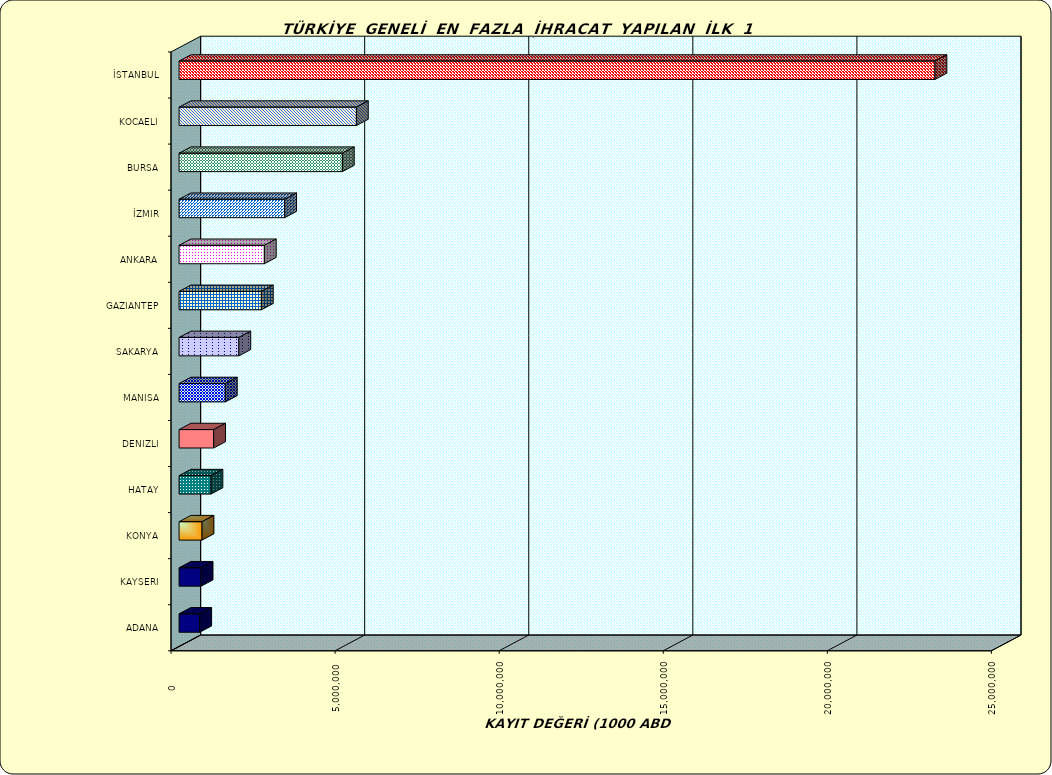
| Category | Series 0 |
|---|---|
| İSTANBUL | 23035047.995 |
| KOCAELI | 5404210.475 |
| BURSA | 4976416.178 |
| İZMIR | 3218469.801 |
| ANKARA | 2598906.577 |
| GAZIANTEP | 2507448.562 |
| SAKARYA | 1822545.963 |
| MANISA | 1410085.672 |
| DENIZLI | 1054094.167 |
| HATAY | 972611.376 |
| KONYA | 700380.859 |
| KAYSERI | 672382.348 |
| ADANA | 629966.567 |